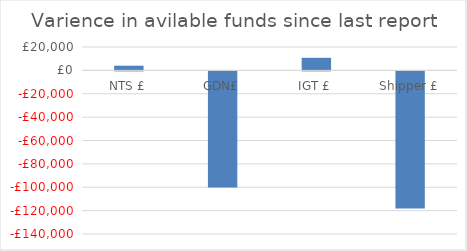
| Category | Varience in avilable funds since last report |
|---|---|
| NTS £ | 4000 |
| GDN£ | -99438.813 |
| IGT £ | 10750 |
| Shipper £ | -117293.91 |